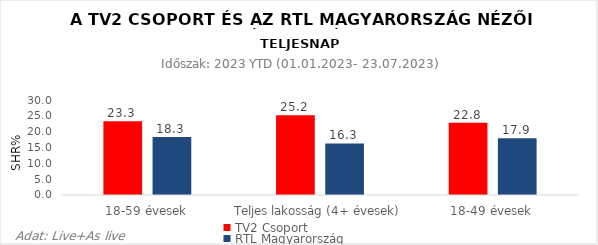
| Category | TV2 Csoport | RTL Magyarország |
|---|---|---|
| 18-59 évesek | 23.3 | 18.3 |
| Teljes lakosság (4+ évesek) | 25.2 | 16.3 |
| 18-49 évesek | 22.8 | 17.9 |